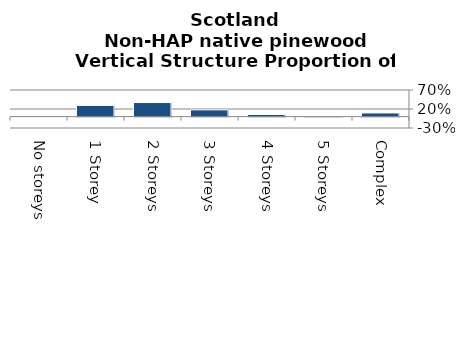
| Category | Non-HAP native pinewood |
|---|---|
| No storeys | 0 |
| 1 Storey | 0.295 |
| 2 Storeys | 0.369 |
| 3 Storeys | 0.178 |
| 4 Storeys | 0.056 |
| 5 Storeys | 0.005 |
| Complex | 0.096 |